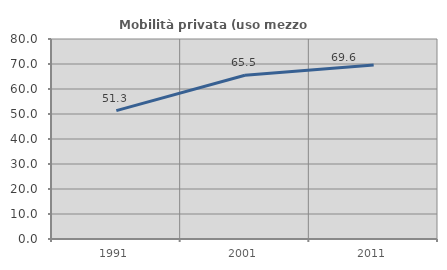
| Category | Mobilità privata (uso mezzo privato) |
|---|---|
| 1991.0 | 51.338 |
| 2001.0 | 65.503 |
| 2011.0 | 69.62 |